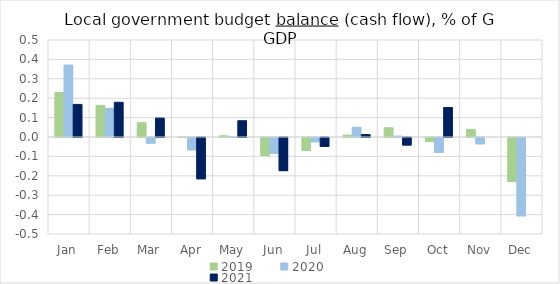
| Category | 2019 | 2020 | 2021 |
|---|---|---|---|
| Jan | 0.229 | 0.371 | 0.168 |
| Feb | 0.163 | 0.148 | 0.179 |
| Mar | 0.074 | -0.029 | 0.097 |
| Apr | 0 | -0.063 | -0.213 |
| May | 0.006 | 0.001 | 0.084 |
| Jun | -0.092 | -0.082 | -0.171 |
| Jul | -0.066 | -0.022 | -0.045 |
| Aug | 0.01 | 0.05 | 0.013 |
| Sep | 0.047 | 0.005 | -0.039 |
| Oct | -0.02 | -0.077 | 0.152 |
| Nov | 0.039 | -0.033 | 0 |
| Dec | -0.227 | -0.404 | 0 |